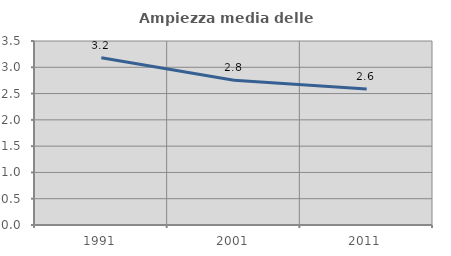
| Category | Ampiezza media delle famiglie |
|---|---|
| 1991.0 | 3.18 |
| 2001.0 | 2.753 |
| 2011.0 | 2.585 |